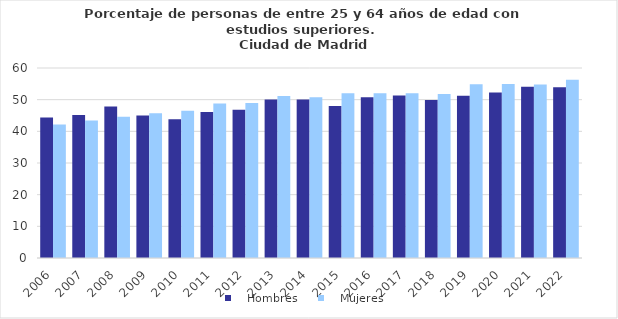
| Category |    Hombres |    Mujeres |
|---|---|---|
| 2006.0 | 44.376 | 42.188 |
| 2007.0 | 45.173 | 43.455 |
| 2008.0 | 47.806 | 44.595 |
| 2009.0 | 45.02 | 45.678 |
| 2010.0 | 43.825 | 46.525 |
| 2011.0 | 46.12 | 48.786 |
| 2012.0 | 46.834 | 48.91 |
| 2013.0 | 50.043 | 51.173 |
| 2014.0 | 50.05 | 50.735 |
| 2015.0 | 48.012 | 52.02 |
| 2016.0 | 50.732 | 52.015 |
| 2017.0 | 51.312 | 52.015 |
| 2018.0 | 49.909 | 51.798 |
| 2019.0 | 51.226 | 54.88 |
| 2020.0 | 52.272 | 54.934 |
| 2021.0 | 54.098 | 54.778 |
| 2022.0 | 53.904 | 56.281 |